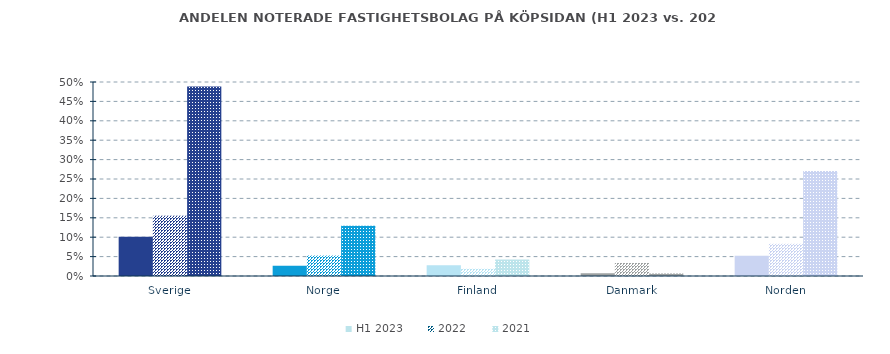
| Category | H1 2023 | 2022 | 2021 |
|---|---|---|---|
| Sverige | 0.101 | 0.156 | 0.489 |
| Norge | 0.027 | 0.053 | 0.129 |
| Finland | 0.028 | 0.018 | 0.043 |
| Danmark | 0.007 | 0.033 | 0.006 |
| Norden | 0.052 | 0.083 | 0.27 |